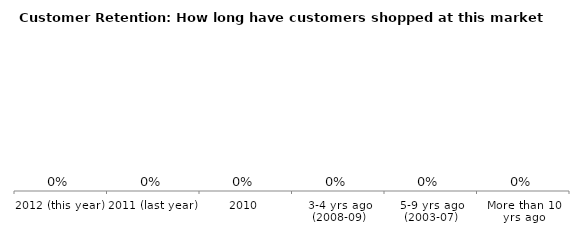
| Category | Series 0 |
|---|---|
| 2012 (this year) | 0 |
| 2011 (last year) | 0 |
| 2010 | 0 |
| 3-4 yrs ago (2008-09) | 0 |
| 5-9 yrs ago (2003-07) | 0 |
| More than 10 yrs ago | 0 |